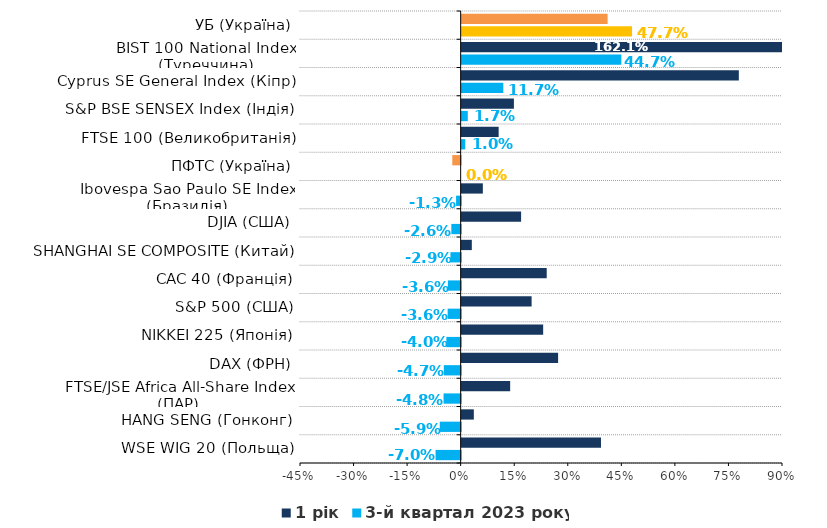
| Category | 3-й квартал 2023 року | 1 рік |
|---|---|---|
| WSE WIG 20 (Польща) | -0.07 | 0.39 |
| HANG SENG (Гонконг) | -0.059 | 0.034 |
| FTSE/JSE Africa All-Share Index (ПАР) | -0.048 | 0.136 |
| DAX (ФРН) | -0.047 | 0.27 |
| NIKKEI 225 (Японія) | -0.04 | 0.228 |
| S&P 500 (США) | -0.036 | 0.196 |
| CAC 40 (Франція) | -0.036 | 0.238 |
| SHANGHAI SE COMPOSITE (Китай) | -0.029 | 0.028 |
| DJIA (США) | -0.026 | 0.166 |
| Ibovespa Sao Paulo SE Index (Бразилія) | -0.013 | 0.059 |
| ПФТС (Україна) | 0 | -0.023 |
| FTSE 100 (Великобританія) | 0.01 | 0.104 |
| S&P BSE SENSEX Index (Індія) | 0.017 | 0.146 |
| Cyprus SE General Index (Кіпр) | 0.117 | 0.776 |
| BIST 100 National Index (Туреччина) | 0.447 | 1.621 |
| УБ (Україна) | 0.477 | 0.409 |